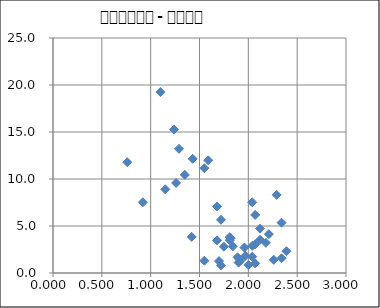
| Category | Series 0 |
|---|---|
| 1.1 | 19.25 |
| 0.92 | 7.53 |
| 1.72 | 5.66 |
| 2.18 | 3.21 |
| 1.75 | 2.8 |
| 2.26 | 1.41 |
| 2.07 | 6.18 |
| 1.43 | 12.15 |
| 1.92 | 1.34 |
| 1.82 | 3.71 |
| 2.34 | 5.35 |
| 2.12 | 4.72 |
| 1.81 | 3.81 |
| 1.35 | 10.44 |
| 1.26 | 9.58 |
| 2.07 | 1.02 |
| 2.04 | 7.52 |
| 1.55 | 1.31 |
| 1.89 | 1.67 |
| 1.68 | 7.07 |
| 0.76 | 11.79 |
| 1.96 | 2.71 |
| 1.29 | 13.21 |
| 1.81 | 3.48 |
| 1.72 | 0.81 |
| 2.39 | 2.32 |
| 1.68 | 3.47 |
| 2.29 | 8.31 |
| 2.34 | 1.57 |
| 2.21 | 4.13 |
| 1.42 | 3.84 |
| 1.97 | 1.83 |
| 2.12 | 3.54 |
| 1.9 | 1.11 |
| 1.15 | 8.9 |
| 1.7 | 1.27 |
| 1.24 | 15.26 |
| 1.55 | 11.15 |
| 2.04 | 1.74 |
| 1.59 | 11.98 |
| 2.07 | 3.04 |
| 2.0 | 0.85 |
| 1.84 | 2.83 |
| 2.04 | 2.89 |